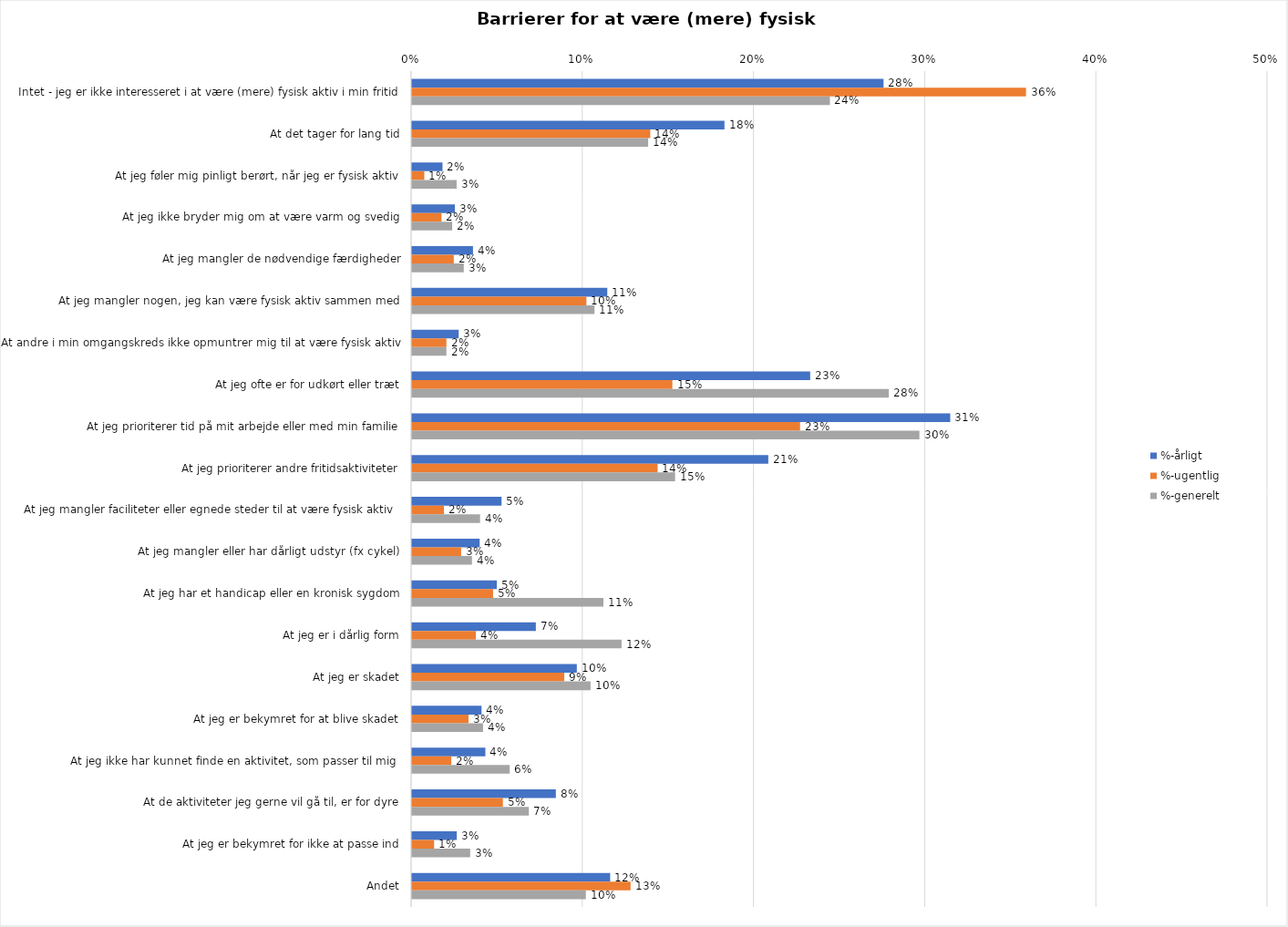
| Category | %-årligt | %-ugentlig | %-generelt |
|---|---|---|---|
| Intet - jeg er ikke interesseret i at være (mere) fysisk aktiv i min fritid | 0.275 | 0.359 | 0.244 |
| At det tager for lang tid | 0.183 | 0.139 | 0.138 |
| At jeg føler mig pinligt berørt, når jeg er fysisk aktiv | 0.018 | 0.007 | 0.026 |
| At jeg ikke bryder mig om at være varm og svedig | 0.025 | 0.017 | 0.023 |
| At jeg mangler de nødvendige færdigheder | 0.036 | 0.024 | 0.03 |
| At jeg mangler nogen, jeg kan være fysisk aktiv sammen med | 0.114 | 0.102 | 0.107 |
| At andre i min omgangskreds ikke opmuntrer mig til at være fysisk aktiv | 0.027 | 0.02 | 0.02 |
| At jeg ofte er for udkørt eller træt | 0.233 | 0.152 | 0.279 |
| At jeg prioriterer tid på mit arbejde eller med min familie | 0.314 | 0.227 | 0.296 |
| At jeg prioriterer andre fritidsaktiviteter | 0.208 | 0.143 | 0.154 |
| At jeg mangler faciliteter eller egnede steder til at være fysisk aktiv  | 0.052 | 0.019 | 0.04 |
| At jeg mangler eller har dårligt udstyr (fx cykel) | 0.04 | 0.029 | 0.035 |
| At jeg har et handicap eller en kronisk sygdom | 0.05 | 0.047 | 0.112 |
| At jeg er i dårlig form | 0.072 | 0.037 | 0.122 |
| At jeg er skadet | 0.096 | 0.089 | 0.104 |
| At jeg er bekymret for at blive skadet | 0.041 | 0.033 | 0.041 |
| At jeg ikke har kunnet finde en aktivitet, som passer til mig  | 0.043 | 0.023 | 0.057 |
| At de aktiviteter jeg gerne vil gå til, er for dyre | 0.084 | 0.053 | 0.068 |
| At jeg er bekymret for ikke at passe ind | 0.026 | 0.013 | 0.034 |
| Andet | 0.116 | 0.128 | 0.102 |